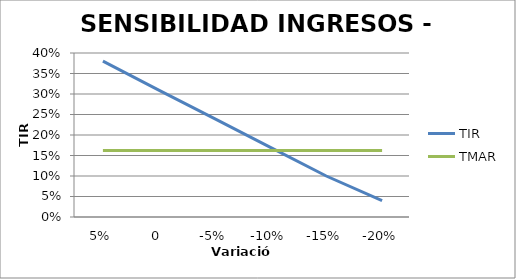
| Category | TIR | TMAR |
|---|---|---|
| 0.05 | 0.38 | 0.162 |
| 0.0 | 0.309 | 0.162 |
| -0.05 | 0.24 | 0.162 |
| -0.1 | 0.17 | 0.162 |
| -0.15 | 0.1 | 0.162 |
| -0.2 | 0.04 | 0.162 |